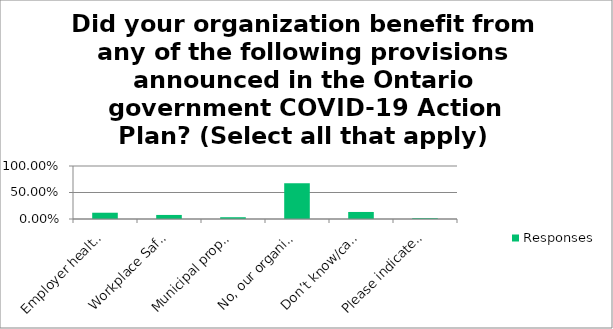
| Category | Responses |
|---|---|
| Employer health tax reduction for organization with $500-1M payroll | 0.118 |
| Workplace Safety and Insurance Board (WSIB) Premium Deferral | 0.077 |
| Municipal property tax deferral | 0.034 |
| No, our organization did not benefit from the above provisions. | 0.675 |
| Don’t know/can’t say. | 0.133 |
| Please indicate other: | 0.016 |